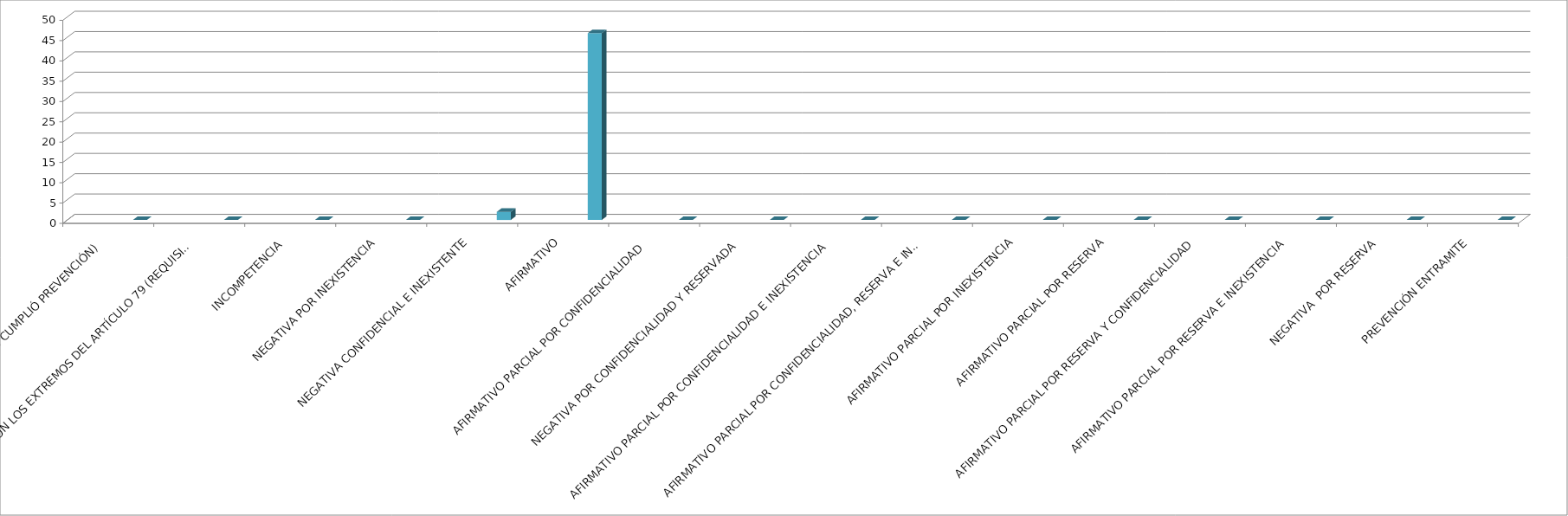
| Category | Series 0 | Series 1 | Series 2 | Series 3 | Series 4 |
|---|---|---|---|---|---|
| SE TIENE POR NO PRESENTADA ( NO CUMPLIÓ PREVENCIÓN) |  |  |  |  | 0 |
| NO CUMPLIO CON LOS EXTREMOS DEL ARTÍCULO 79 (REQUISITOS) |  |  |  |  | 0 |
| INCOMPETENCIA  |  |  |  |  | 0 |
| NEGATIVA POR INEXISTENCIA |  |  |  |  | 0 |
| NEGATIVA CONFIDENCIAL E INEXISTENTE |  |  |  |  | 2 |
| AFIRMATIVO |  |  |  |  | 46 |
| AFIRMATIVO PARCIAL POR CONFIDENCIALIDAD  |  |  |  |  | 0 |
| NEGATIVA POR CONFIDENCIALIDAD Y RESERVADA |  |  |  |  | 0 |
| AFIRMATIVO PARCIAL POR CONFIDENCIALIDAD E INEXISTENCIA |  |  |  |  | 0 |
| AFIRMATIVO PARCIAL POR CONFIDENCIALIDAD, RESERVA E INEXISTENCIA |  |  |  |  | 0 |
| AFIRMATIVO PARCIAL POR INEXISTENCIA |  |  |  |  | 0 |
| AFIRMATIVO PARCIAL POR RESERVA |  |  |  |  | 0 |
| AFIRMATIVO PARCIAL POR RESERVA Y CONFIDENCIALIDAD |  |  |  |  | 0 |
| AFIRMATIVO PARCIAL POR RESERVA E INEXISTENCIA |  |  |  |  | 0 |
| NEGATIVA  POR RESERVA |  |  |  |  | 0 |
| PREVENCIÓN ENTRAMITE |  |  |  |  | 0 |